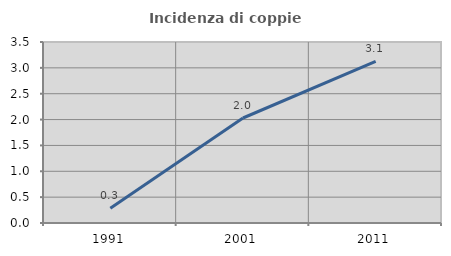
| Category | Incidenza di coppie miste |
|---|---|
| 1991.0 | 0.283 |
| 2001.0 | 2.03 |
| 2011.0 | 3.125 |